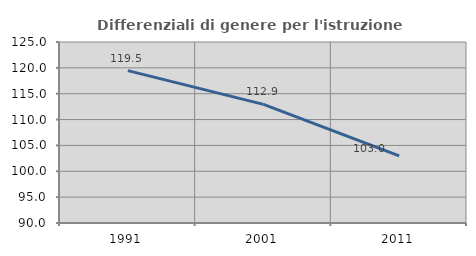
| Category | Differenziali di genere per l'istruzione superiore |
|---|---|
| 1991.0 | 119.471 |
| 2001.0 | 112.946 |
| 2011.0 | 102.995 |